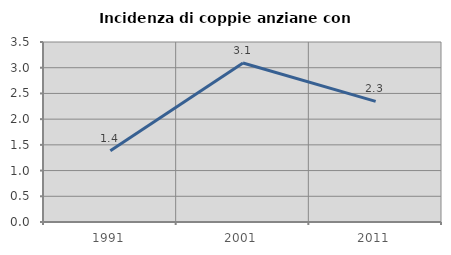
| Category | Incidenza di coppie anziane con figli |
|---|---|
| 1991.0 | 1.386 |
| 2001.0 | 3.091 |
| 2011.0 | 2.346 |